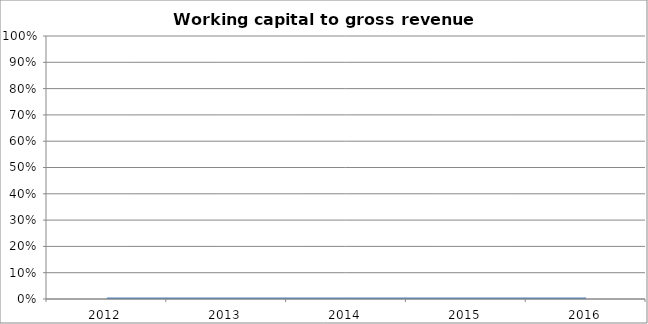
| Category | Working capital to gross revenue [2/H] |
|---|---|
| 2012.0 | 0 |
| 2013.0 | 0 |
| 2014.0 | 0 |
| 2015.0 | 0 |
| 2016.0 | 0 |